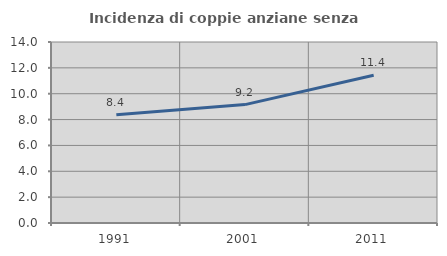
| Category | Incidenza di coppie anziane senza figli  |
|---|---|
| 1991.0 | 8.367 |
| 2001.0 | 9.159 |
| 2011.0 | 11.434 |